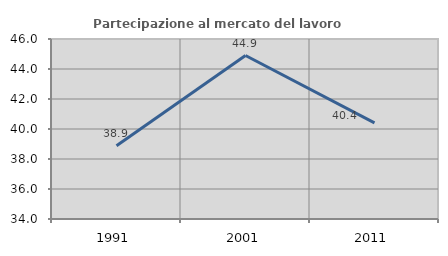
| Category | Partecipazione al mercato del lavoro  femminile |
|---|---|
| 1991.0 | 38.889 |
| 2001.0 | 44.898 |
| 2011.0 | 40.404 |